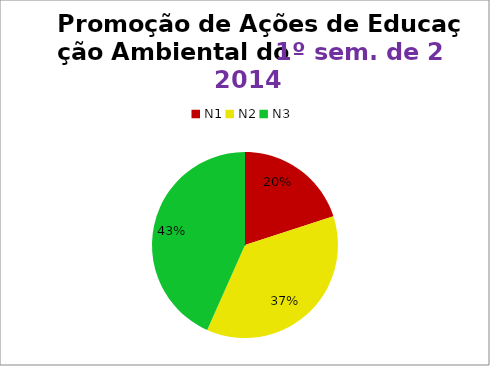
| Category | 1º/14 |
|---|---|
| N1 | 6 |
| N2 | 11 |
| N3 | 13 |